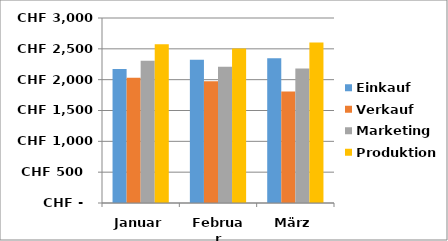
| Category | Einkauf | Verkauf | Marketing | Produktion |
|---|---|---|---|---|
| Januar | 2171 | 2033 | 2306 | 2576 |
| Februar | 2324 | 1975 | 2210 | 2506 |
| März | 2348 | 1809 | 2182 | 2603 |